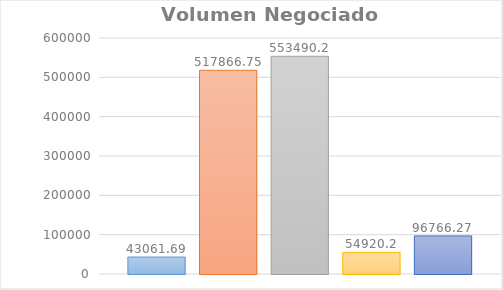
| Category | Lunes | Martes | Miercoles | Jueves | Viernes |
|---|---|---|---|---|---|
| 0 | 43061.69 | 517866.75 | 553490.2 | 54920.2 | 96766.27 |